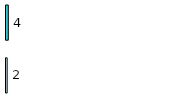
| Category | Series 0 | Series 1 |
|---|---|---|
| 0 | 2 | 4 |